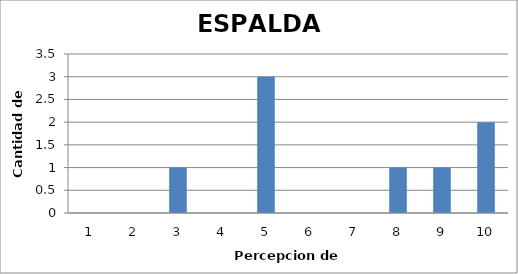
| Category | Series 0 |
|---|---|
| 0 | 0 |
| 1 | 0 |
| 2 | 1 |
| 3 | 0 |
| 4 | 3 |
| 5 | 0 |
| 6 | 0 |
| 7 | 1 |
| 8 | 1 |
| 9 | 2 |